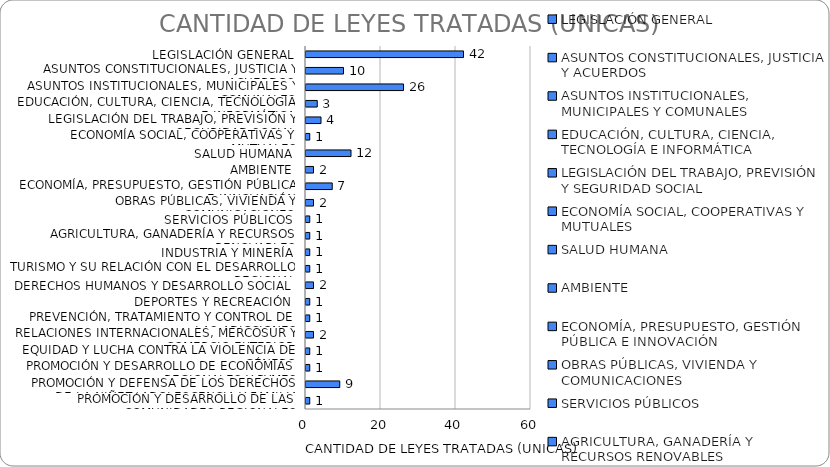
| Category | CANTIDAD DE LEYES TRATADAS (UNICAS) |
|---|---|
| LEGISLACIÓN GENERAL | 42 |
| ASUNTOS CONSTITUCIONALES, JUSTICIA Y ACUERDOS | 10 |
| ASUNTOS INSTITUCIONALES, MUNICIPALES Y COMUNALES | 26 |
| EDUCACIÓN, CULTURA, CIENCIA, TECNOLOGÍA E INFORMÁTICA | 3 |
| LEGISLACIÓN DEL TRABAJO, PREVISIÓN Y SEGURIDAD SOCIAL | 4 |
| ECONOMÍA SOCIAL, COOPERATIVAS Y MUTUALES | 1 |
| SALUD HUMANA | 12 |
| AMBIENTE | 2 |
| ECONOMÍA, PRESUPUESTO, GESTIÓN PÚBLICA E INNOVACIÓN | 7 |
| OBRAS PÚBLICAS, VIVIENDA Y COMUNICACIONES | 2 |
| SERVICIOS PÚBLICOS | 1 |
| AGRICULTURA, GANADERÍA Y RECURSOS RENOVABLES | 1 |
| INDUSTRIA Y MINERÍA | 1 |
| TURISMO Y SU RELACIÓN CON EL DESARROLLO REGIONAL | 1 |
| DERECHOS HUMANOS Y DESARROLLO SOCIAL | 2 |
| DEPORTES Y RECREACIÓN | 1 |
| PREVENCIÓN, TRATAMIENTO Y CONTROL DE LAS ADICCIONES | 1 |
| RELACIONES INTERNACIONALES, MERCOSUR Y COMERCIO EXTERIOR | 2 |
| EQUIDAD Y LUCHA CONTRA LA VIOLENCIA DE GÉNERO | 1 |
| PROMOCIÓN Y DESARROLLO DE ECONOMÍAS REGIONALES Y PYMES | 1 |
| PROMOCIÓN Y DEFENSA DE LOS DERECHOS DE LA NIÑEZ, ADOLESCENCIA Y FAMILIA | 9 |
| PROMOCIÓN Y DESARROLLO DE LAS COMUNIDADES REGIONALES | 1 |